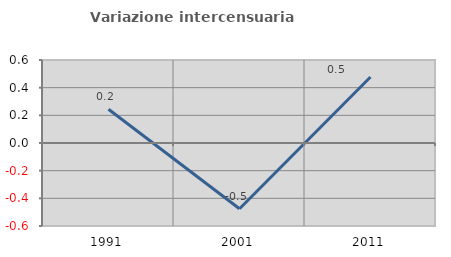
| Category | Variazione intercensuaria annua |
|---|---|
| 1991.0 | 0.244 |
| 2001.0 | -0.475 |
| 2011.0 | 0.477 |